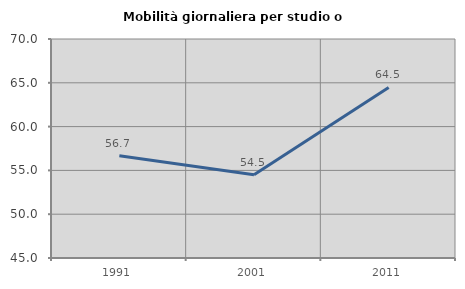
| Category | Mobilità giornaliera per studio o lavoro |
|---|---|
| 1991.0 | 56.671 |
| 2001.0 | 54.494 |
| 2011.0 | 64.472 |